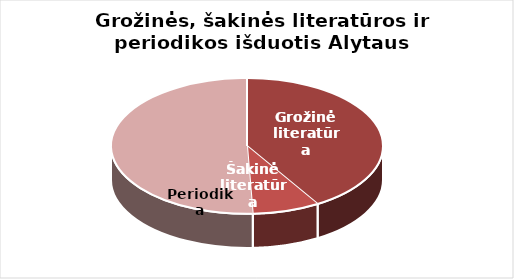
| Category | Series 0 |
|---|---|
| Grožinė literatūra | 506488 |
| Šakinė literatūra | 98244 |
| Periodika | 621108 |